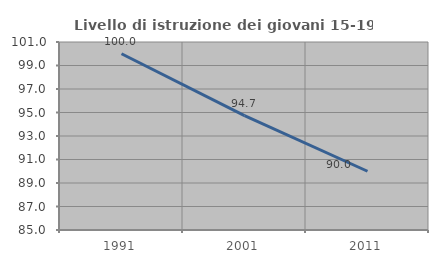
| Category | Livello di istruzione dei giovani 15-19 anni |
|---|---|
| 1991.0 | 100 |
| 2001.0 | 94.737 |
| 2011.0 | 90 |